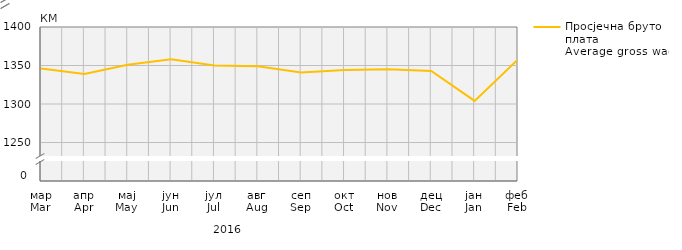
| Category | Просјечна бруто плата
Average gross wage |
|---|---|
| мар
Mar | 1346 |
| апр
Apr | 1339 |
| мај
May | 1351 |
| јун
Jun | 1358 |
| јул
Jul | 1350 |
| авг
Aug | 1349 |
| сеп
Sep | 1341 |
| окт
Oct | 1344 |
| нов
Nov | 1345 |
| дец
Dec | 1343 |
| јан
Jan | 1304 |
| феб
Feb | 1358 |